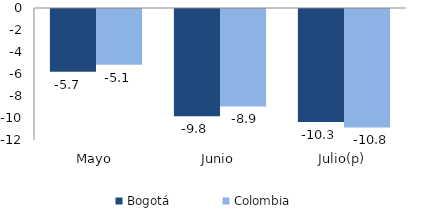
| Category | Bogotá | Colombia |
|---|---|---|
| Mayo | -5.709 | -5.063 |
| Junio | -9.758 | -8.854 |
| Julio(p) | -10.263 | -10.762 |